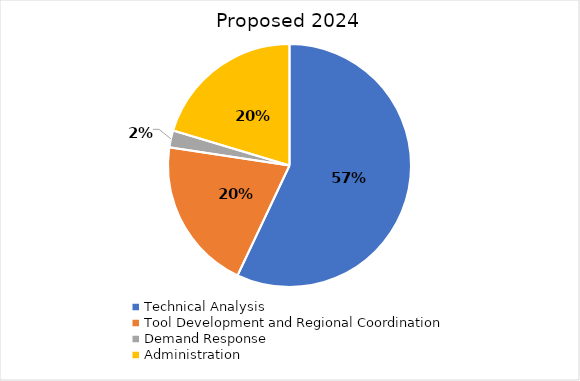
| Category | Proposed 2020 |
|---|---|
| Technical Analysis | 0.57 |
| Tool Development and Regional Coordination  | 0.204 |
| Demand Response | 0.023 |
| Administration | 0.204 |